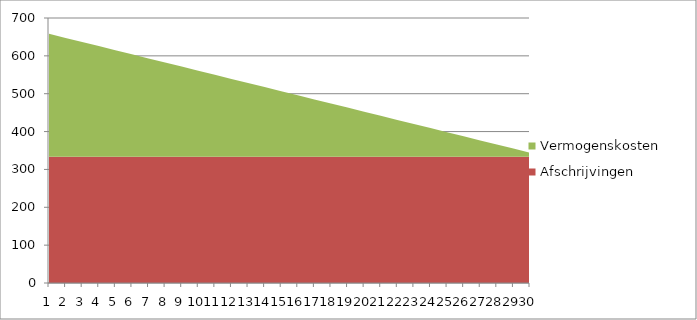
| Category | Afschrijvingen | Vermogenskosten |
|---|---|---|
| 0 | 333.333 | 325 |
| 1 | 333.333 | 314.167 |
| 2 | 333.333 | 303.333 |
| 3 | 333.333 | 292.5 |
| 4 | 333.333 | 281.667 |
| 5 | 333.333 | 270.833 |
| 6 | 333.333 | 260 |
| 7 | 333.333 | 249.167 |
| 8 | 333.333 | 238.333 |
| 9 | 333.333 | 227.5 |
| 10 | 333.333 | 216.667 |
| 11 | 333.333 | 205.833 |
| 12 | 333.333 | 195 |
| 13 | 333.333 | 184.167 |
| 14 | 333.333 | 173.333 |
| 15 | 333.333 | 162.5 |
| 16 | 333.333 | 151.667 |
| 17 | 333.333 | 140.833 |
| 18 | 333.333 | 130 |
| 19 | 333.333 | 119.167 |
| 20 | 333.333 | 108.333 |
| 21 | 333.333 | 97.5 |
| 22 | 333.333 | 86.667 |
| 23 | 333.333 | 75.833 |
| 24 | 333.333 | 65 |
| 25 | 333.333 | 54.167 |
| 26 | 333.333 | 43.333 |
| 27 | 333.333 | 32.5 |
| 28 | 333.333 | 21.667 |
| 29 | 333.333 | 10.833 |